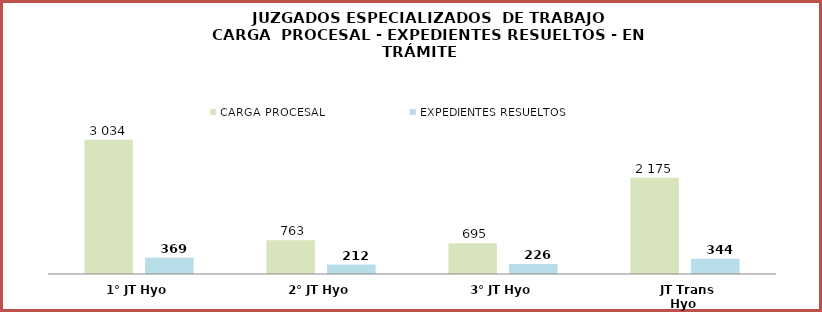
| Category | CARGA PROCESAL | EXPEDIENTES RESUELTOS |
|---|---|---|
| 1° JT Hyo | 3034 | 369 |
| 2° JT Hyo | 763 | 212 |
| 3° JT Hyo | 695 | 226 |
| JT Trans Hyo | 2175 | 344 |